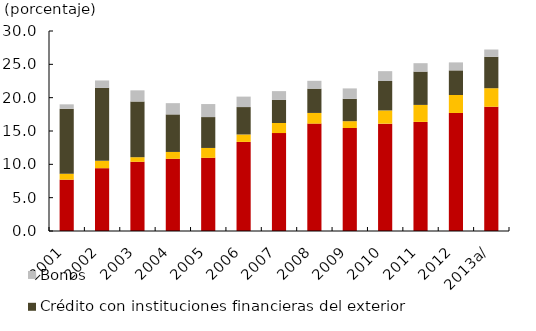
| Category | Crédito en pesos con instituciones financieras nacionales   | Crédito en moneda extranjera con instituciones financieras nacionales   | Crédito con instituciones financieras del exterior | Bonos |
|---|---|---|---|---|
| 2001 | 7.698 | 0.903 | 9.754 | 0.646 |
| 2002 | 9.422 | 1.102 | 10.954 | 1.106 |
| 2003 | 10.377 | 0.695 | 8.354 | 1.673 |
| 2004 | 10.826 | 1.032 | 5.632 | 1.686 |
| 2005 | 10.976 | 1.48 | 4.633 | 1.953 |
| 2006 | 13.363 | 1.117 | 4.111 | 1.569 |
| 2007 | 14.692 | 1.51 | 3.453 | 1.327 |
| 2008 | 16.107 | 1.602 | 3.643 | 1.18 |
| 2009 | 15.449 | 1.024 | 3.349 | 1.566 |
| 2010 | 16.102 | 1.985 | 4.412 | 1.478 |
| 2011 | 16.365 | 2.549 | 4.999 | 1.257 |
| 2012 | 17.705 | 2.697 | 3.692 | 1.194 |
| 2013a/ | 18.636 | 2.784 | 4.715 | 1.09 |